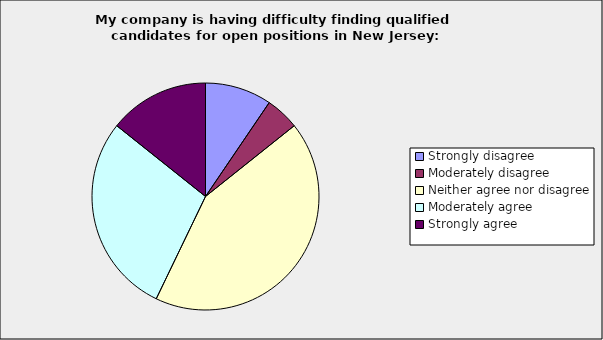
| Category | Series 0 |
|---|---|
| Strongly disagree | 0.095 |
| Moderately disagree | 0.048 |
| Neither agree nor disagree | 0.429 |
| Moderately agree | 0.286 |
| Strongly agree | 0.143 |